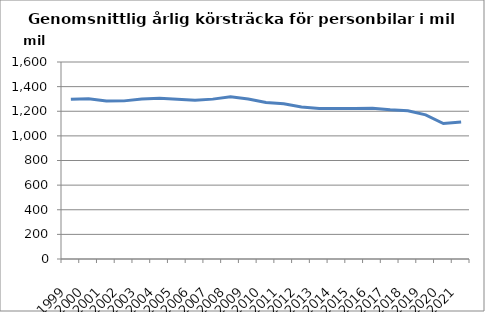
| Category | Series 0 |
|---|---|
| 1999.0 | 1297.356 |
| 2000.0 | 1302.123 |
| 2001.0 | 1282.789 |
| 2002.0 | 1284.262 |
| 2003.0 | 1300.096 |
| 2004.0 | 1306.096 |
| 2005.0 | 1297.872 |
| 2006.0 | 1289.576 |
| 2007.0 | 1298.448 |
| 2008.0 | 1317.396 |
| 2009.0 | 1299.235 |
| 2010.0 | 1270.911 |
| 2011.0 | 1260.065 |
| 2012.0 | 1235.288 |
| 2013.0 | 1222.991 |
| 2014.0 | 1221.821 |
| 2015.0 | 1221.564 |
| 2016.0 | 1224.04 |
| 2017.0 | 1211.43 |
| 2018.0 | 1204.247 |
| 2019.0 | 1171.085 |
| 2020.0 | 1099.946 |
| 2021.0 | 1112.056 |